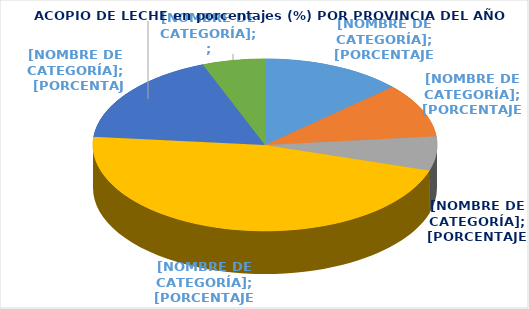
| Category | Series 0 |
|---|---|
| AZANGARO | 2775624 |
| HUANCANE | 2127096 |
| LAMPA | 1345920 |
| MELGAR | 9784699 |
| PUNO | 3692745 |
| SAN ROMAN | 1232500 |